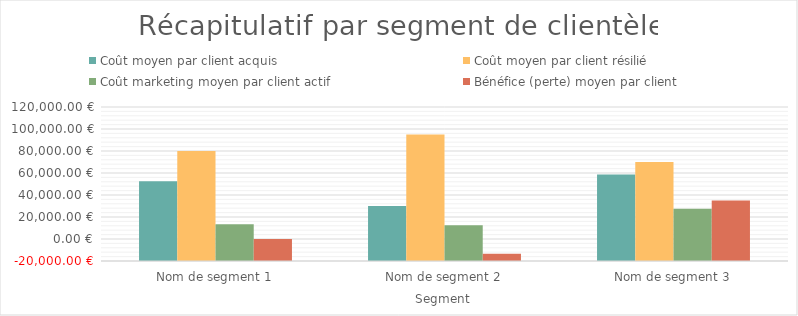
| Category | Coût moyen par client acquis | Coût moyen par client résilié | Coût marketing moyen par client actif | Bénéfice (perte) moyen par client |
|---|---|---|---|---|
| Nom de segment 1 | 52500 | 80000 | 13333.333 | 0 |
| Nom de segment 2 | 30000 | 95000 | 12500 | -13500 |
| Nom de segment 3 | 58750 | 70000 | 27500 | 35000 |